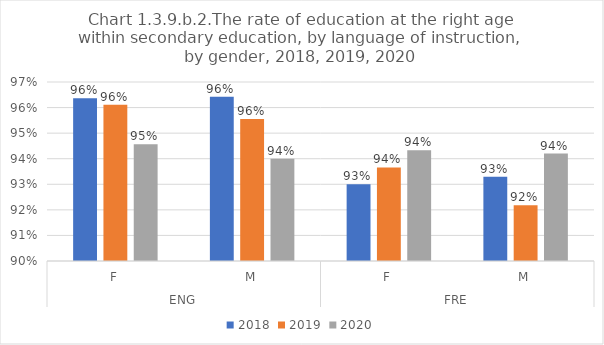
| Category | 2018 | 2019 | 2020 |
|---|---|---|---|
| 0 | 0.964 | 0.961 | 0.946 |
| 1 | 0.964 | 0.956 | 0.94 |
| 2 | 0.93 | 0.937 | 0.943 |
| 3 | 0.933 | 0.922 | 0.942 |